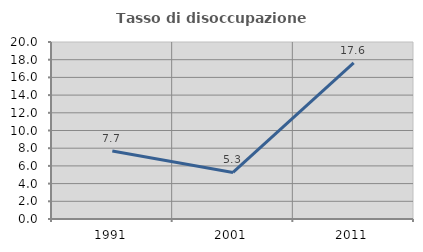
| Category | Tasso di disoccupazione giovanile  |
|---|---|
| 1991.0 | 7.692 |
| 2001.0 | 5.263 |
| 2011.0 | 17.647 |